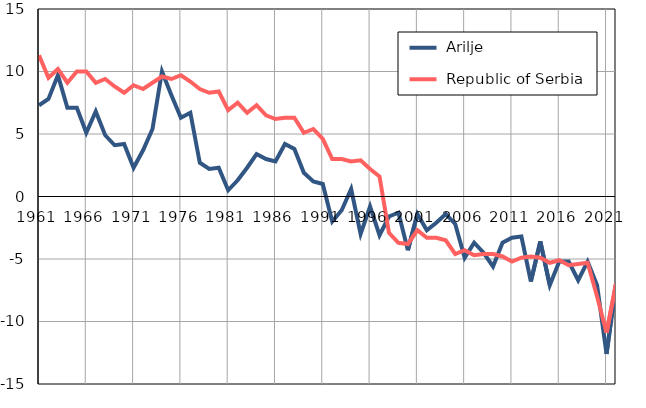
| Category |  Arilje |  Republic of Serbia |
|---|---|---|
| 1961.0 | 7.3 | 11.3 |
| 1962.0 | 7.8 | 9.5 |
| 1963.0 | 9.7 | 10.2 |
| 1964.0 | 7.1 | 9.1 |
| 1965.0 | 7.1 | 10 |
| 1966.0 | 5.1 | 10 |
| 1967.0 | 6.8 | 9.1 |
| 1968.0 | 4.9 | 9.4 |
| 1969.0 | 4.1 | 8.8 |
| 1970.0 | 4.2 | 8.3 |
| 1971.0 | 2.3 | 8.9 |
| 1972.0 | 3.7 | 8.6 |
| 1973.0 | 5.4 | 9.1 |
| 1974.0 | 10 | 9.6 |
| 1975.0 | 8.1 | 9.4 |
| 1976.0 | 6.3 | 9.7 |
| 1977.0 | 6.7 | 9.2 |
| 1978.0 | 2.7 | 8.6 |
| 1979.0 | 2.2 | 8.3 |
| 1980.0 | 2.3 | 8.4 |
| 1981.0 | 0.5 | 6.9 |
| 1982.0 | 1.3 | 7.5 |
| 1983.0 | 2.3 | 6.7 |
| 1984.0 | 3.4 | 7.3 |
| 1985.0 | 3 | 6.5 |
| 1986.0 | 2.8 | 6.2 |
| 1987.0 | 4.2 | 6.3 |
| 1988.0 | 3.8 | 6.3 |
| 1989.0 | 1.9 | 5.1 |
| 1990.0 | 1.2 | 5.4 |
| 1991.0 | 1 | 4.6 |
| 1992.0 | -2 | 3 |
| 1993.0 | -1.1 | 3 |
| 1994.0 | 0.6 | 2.8 |
| 1995.0 | -3 | 2.9 |
| 1996.0 | -0.8 | 2.2 |
| 1997.0 | -3.1 | 1.6 |
| 1998.0 | -1.6 | -2.9 |
| 1999.0 | -1.3 | -3.7 |
| 2000.0 | -4.3 | -3.8 |
| 2001.0 | -1.4 | -2.7 |
| 2002.0 | -2.7 | -3.3 |
| 2003.0 | -2.1 | -3.3 |
| 2004.0 | -1.4 | -3.5 |
| 2005.0 | -2.2 | -4.6 |
| 2006.0 | -4.9 | -4.3 |
| 2007.0 | -3.7 | -4.7 |
| 2008.0 | -4.5 | -4.6 |
| 2009.0 | -5.6 | -4.6 |
| 2010.0 | -3.7 | -4.8 |
| 2011.0 | -3.3 | -5.2 |
| 2012.0 | -3.2 | -4.9 |
| 2013.0 | -6.8 | -4.8 |
| 2014.0 | -3.6 | -4.9 |
| 2015.0 | -7.1 | -5.3 |
| 2016.0 | -5.2 | -5.1 |
| 2017.0 | -5.2 | -5.5 |
| 2018.0 | -6.7 | -5.4 |
| 2019.0 | -5.2 | -5.3 |
| 2020.0 | -7.1 | -8 |
| 2021.0 | -12.6 | -10.9 |
| 2022.0 | -7 | -7 |